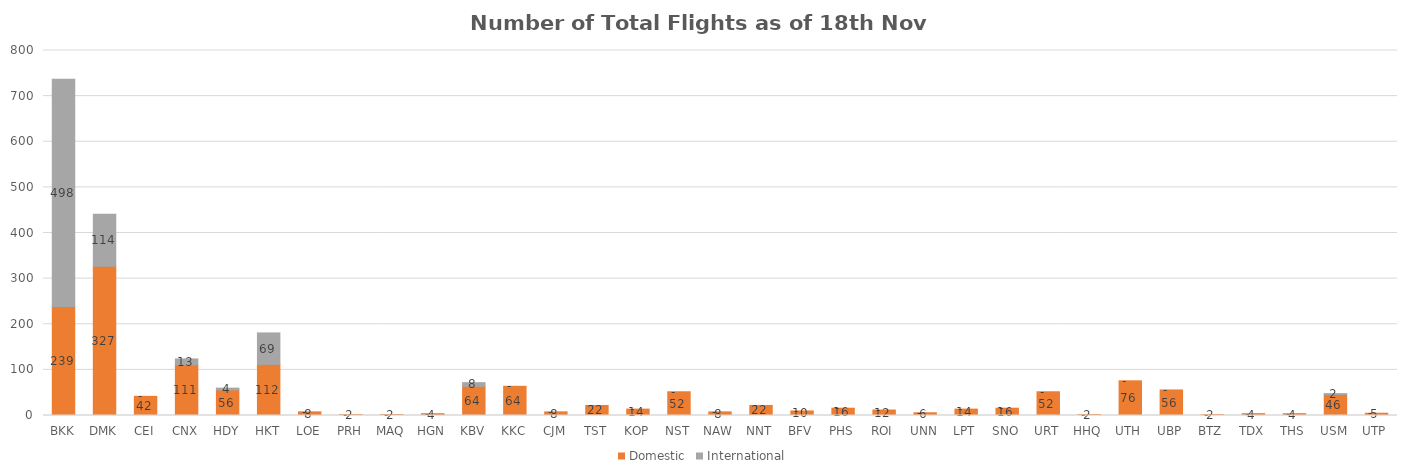
| Category | Domestic | International |
|---|---|---|
| BKK | 239 | 498 |
| DMK | 327 | 114 |
| CEI | 42 | 0 |
| CNX | 111 | 13 |
| HDY | 56 | 4 |
| HKT | 112 | 69 |
| LOE | 8 | 0 |
| PRH | 2 | 0 |
| MAQ | 2 | 0 |
| HGN | 4 | 0 |
| KBV | 64 | 8 |
| KKC | 64 | 0 |
| CJM | 8 | 0 |
| TST | 22 | 0 |
| KOP | 14 | 0 |
| NST | 52 | 0 |
| NAW | 8 | 0 |
| NNT | 22 | 0 |
| BFV | 10 | 0 |
| PHS | 16 | 0 |
| ROI | 12 | 0 |
| UNN | 6 | 0 |
| LPT | 14 | 0 |
| SNO | 16 | 0 |
| URT | 52 | 0 |
| HHQ | 2 | 0 |
| UTH | 76 | 0 |
| UBP | 56 | 0 |
| BTZ | 2 | 0 |
| TDX | 4 | 0 |
| THS | 4 | 0 |
| USM | 46 | 2 |
| UTP | 5 | 0 |